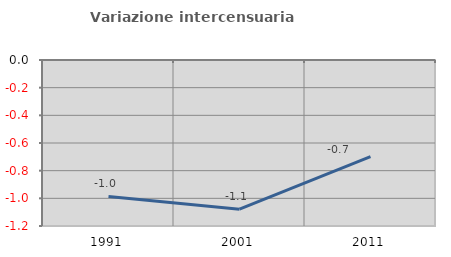
| Category | Variazione intercensuaria annua |
|---|---|
| 1991.0 | -0.986 |
| 2001.0 | -1.078 |
| 2011.0 | -0.699 |